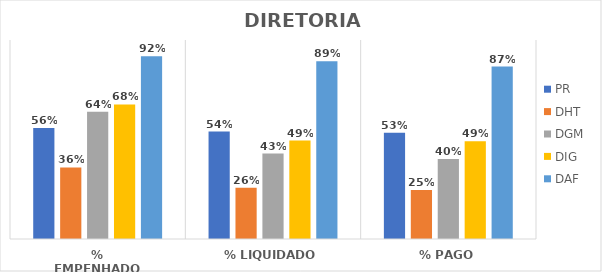
| Category | PR | DHT | DGM | DIG | DAF |
|---|---|---|---|---|---|
| % EMPENHADO | 0.558 | 0.36 | 0.639 | 0.676 | 0.918 |
| % LIQUIDADO | 0.54 | 0.257 | 0.429 | 0.494 | 0.893 |
| % PAGO | 0.534 | 0.247 | 0.402 | 0.491 | 0.866 |